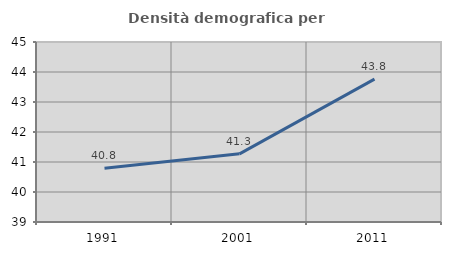
| Category | Densità demografica |
|---|---|
| 1991.0 | 40.794 |
| 2001.0 | 41.272 |
| 2011.0 | 43.762 |